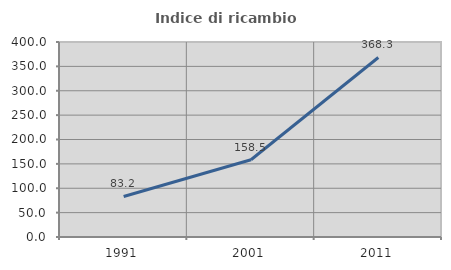
| Category | Indice di ricambio occupazionale  |
|---|---|
| 1991.0 | 83.158 |
| 2001.0 | 158.491 |
| 2011.0 | 368.293 |